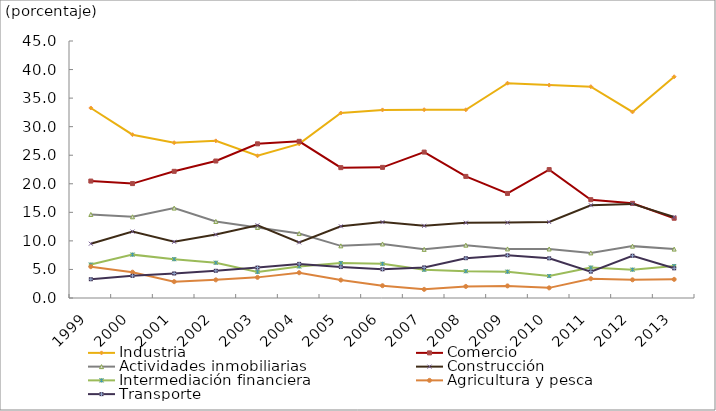
| Category | Industria | Comercio | Actividades inmobiliarias | Construcción  | Intermediación financiera | Agricultura y pesca | Transporte |
|---|---|---|---|---|---|---|---|
| 1999.0 | 33.272 | 20.475 | 14.625 | 9.506 | 5.85 | 5.484 | 3.291 |
| 2000.0 | 28.595 | 20.032 | 14.216 | 11.632 | 7.593 | 4.523 | 3.877 |
| 2001.0 | 27.191 | 22.182 | 15.742 | 9.839 | 6.798 | 2.862 | 4.293 |
| 2002.0 | 27.513 | 23.986 | 13.404 | 11.111 | 6.173 | 3.175 | 4.762 |
| 2003.0 | 24.905 | 26.996 | 12.357 | 12.738 | 4.563 | 3.612 | 5.323 |
| 2004.0 | 26.991 | 27.434 | 11.283 | 9.735 | 5.531 | 4.425 | 5.973 |
| 2005.0 | 32.382 | 22.825 | 9.13 | 12.553 | 6.134 | 3.138 | 5.421 |
| 2006.0 | 32.934 | 22.874 | 9.461 | 13.293 | 5.988 | 2.156 | 5.03 |
| 2007.0 | 32.967 | 25.549 | 8.516 | 12.637 | 4.945 | 1.511 | 5.357 |
| 2008.0 | 32.953 | 21.293 | 9.252 | 13.181 | 4.689 | 2.028 | 6.971 |
| 2009.0 | 37.609 | 18.306 | 8.593 | 13.2 | 4.608 | 2.117 | 7.472 |
| 2010.0 | 37.278 | 22.485 | 8.58 | 13.314 | 3.846 | 1.775 | 6.953 |
| 2011.0 | 37.001 | 17.214 | 7.897 | 16.238 | 5.324 | 3.372 | 4.614 |
| 2012.0 | 32.584 | 16.573 | 9.082 | 16.479 | 4.963 | 3.184 | 7.397 |
| 2013.0 | 38.736 | 13.965 | 8.563 | 14.169 | 5.607 | 3.262 | 5.199 |